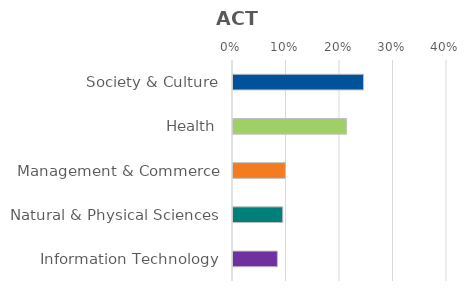
| Category | Series 0 |
|---|---|
| Society & Culture | 0.244 |
| Health | 0.212 |
| Management & Commerce | 0.098 |
| Natural & Physical Sciences | 0.093 |
| Information Technology | 0.083 |